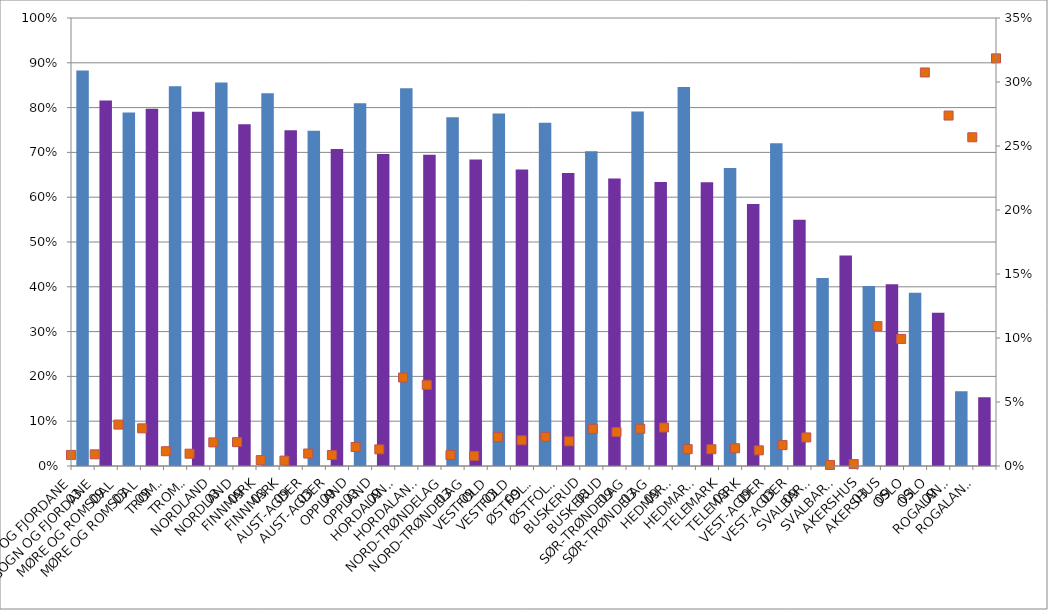
| Category | Norsk privat eierskaps andel verdiskaping (venstre akse) |
|---|---|
| 0 | 0.883 |
| 1 | 0.816 |
| 2 | 0.789 |
| 3 | 0.797 |
| 4 | 0.848 |
| 5 | 0.79 |
| 6 | 0.856 |
| 7 | 0.763 |
| 8 | 0.832 |
| 9 | 0.749 |
| 10 | 0.749 |
| 11 | 0.708 |
| 12 | 0.81 |
| 13 | 0.696 |
| 14 | 0.843 |
| 15 | 0.695 |
| 16 | 0.779 |
| 17 | 0.684 |
| 18 | 0.787 |
| 19 | 0.662 |
| 20 | 0.766 |
| 21 | 0.654 |
| 22 | 0.703 |
| 23 | 0.641 |
| 24 | 0.791 |
| 25 | 0.634 |
| 26 | 0.846 |
| 27 | 0.633 |
| 28 | 0.665 |
| 29 | 0.585 |
| 30 | 0.72 |
| 31 | 0.55 |
| 32 | 0.419 |
| 33 | 0.47 |
| 34 | 0.402 |
| 35 | 0.406 |
| 36 | 0.387 |
| 37 | 0.342 |
| 38 | 0.167 |
| 39 | 0.153 |